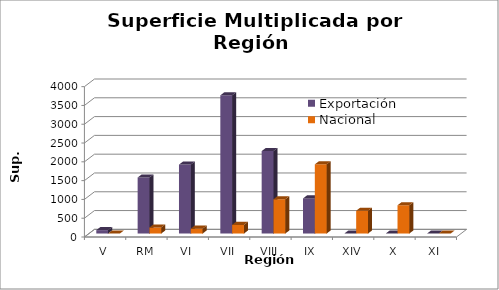
| Category | Exportación | Nacional |
|---|---|---|
| V | 91.2 | 0 |
| RM | 1490.7 | 161.9 |
| VI | 1834 | 130 |
| VII | 3677 | 230 |
| VIII | 2193 | 912 |
| IX | 934 | 1841 |
| XIV | 0 | 606.5 |
| X | 0 | 752.3 |
| XI | 0 | 1.55 |